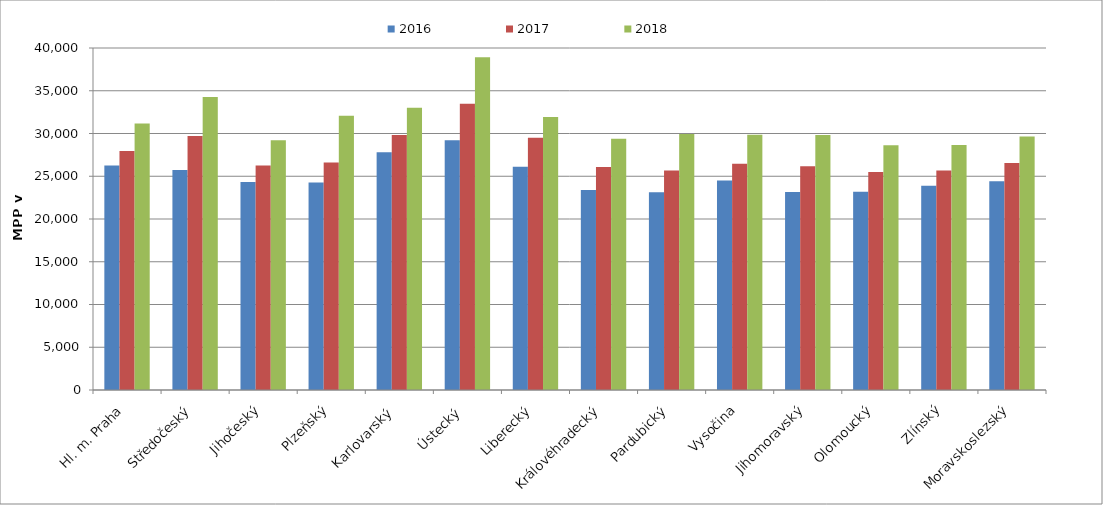
| Category | 2016 | 2017 | 2018 |
|---|---|---|---|
| Hl. m. Praha | 26249.084 | 27957.41 | 31155.046 |
| Středočeský | 25741.935 | 29712.528 | 34266.541 |
| Jihočeský | 24322.476 | 26250.327 | 29216.967 |
| Plzeňský | 24258.706 | 26618.366 | 32089.788 |
| Karlovarský  | 27798.58 | 29835.545 | 33010.814 |
| Ústecký   | 29208.98 | 33490.066 | 38918.988 |
| Liberecký | 26122.97 | 29501.045 | 31920.659 |
| Královéhradecký | 23400.995 | 26082.474 | 29384.536 |
| Pardubický | 23128.02 | 25661.597 | 29954.449 |
| Vysočina | 24500.758 | 26460.99 | 29848.596 |
| Jihomoravský | 23161.446 | 26172.113 | 29817.28 |
| Olomoucký | 23192.982 | 25495.918 | 28631.633 |
| Zlínský | 23901.292 | 25678.024 | 28651.067 |
| Moravskoslezský | 24422.574 | 26536.524 | 29662.633 |